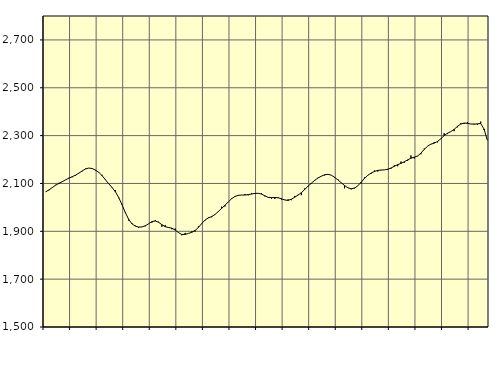
| Category | Piggar | Series 1 |
|---|---|---|
| nan | 2064.3 | 2064.78 |
| 87.0 | 2071.5 | 2073.1 |
| 87.0 | 2081.8 | 2083 |
| 87.0 | 2094.2 | 2092.59 |
| nan | 2102.5 | 2100.34 |
| 88.0 | 2106.4 | 2107.5 |
| 88.0 | 2115.4 | 2115.23 |
| 88.0 | 2123.7 | 2122.23 |
| nan | 2125.8 | 2128.19 |
| 89.0 | 2132.4 | 2134.74 |
| 89.0 | 2144.1 | 2143.06 |
| 89.0 | 2150.8 | 2152.45 |
| nan | 2162.1 | 2160.6 |
| 90.0 | 2164.4 | 2164.49 |
| 90.0 | 2161.6 | 2162.44 |
| 90.0 | 2154.4 | 2155.98 |
| nan | 2147.6 | 2146.3 |
| 91.0 | 2135.9 | 2132.57 |
| 91.0 | 2116.9 | 2115.5 |
| 91.0 | 2098.9 | 2098.54 |
| nan | 2081.7 | 2083.09 |
| 92.0 | 2072.7 | 2065.15 |
| 92.0 | 2038.4 | 2041.03 |
| 92.0 | 2012.4 | 2010.73 |
| nan | 1980.1 | 1978.08 |
| 93.0 | 1945.1 | 1949.94 |
| 93.0 | 1933.8 | 1930.96 |
| 93.0 | 1923.7 | 1921.59 |
| nan | 1915.2 | 1917.77 |
| 94.0 | 1918.5 | 1918.19 |
| 94.0 | 1920.7 | 1923.23 |
| 94.0 | 1931.4 | 1931.52 |
| nan | 1936.2 | 1940.31 |
| 95.0 | 1947.3 | 1943.38 |
| 95.0 | 1939.7 | 1937.77 |
| 95.0 | 1919.2 | 1927.63 |
| nan | 1925.8 | 1919.27 |
| 96.0 | 1914.3 | 1915.89 |
| 96.0 | 1908.7 | 1912.99 |
| 96.0 | 1911.4 | 1905.23 |
| nan | 1893.8 | 1894.56 |
| 97.0 | 1883.3 | 1886.83 |
| 97.0 | 1893.3 | 1887.03 |
| 97.0 | 1891.8 | 1891.23 |
| nan | 1899.6 | 1895.78 |
| 98.0 | 1898.9 | 1903.56 |
| 98.0 | 1920.5 | 1916.37 |
| 98.0 | 1931.3 | 1932.26 |
| nan | 1945.7 | 1947.08 |
| 99.0 | 1958 | 1955.97 |
| 99.0 | 1958.6 | 1961.88 |
| 99.0 | 1970.8 | 1970.31 |
| nan | 1981.7 | 1982.82 |
| 0.0 | 2002.9 | 1995.95 |
| 0.0 | 2003.7 | 2008.91 |
| 0.0 | 2023 | 2022.83 |
| nan | 2037.6 | 2036.16 |
| 1.0 | 2044.1 | 2045.68 |
| 1.0 | 2051.8 | 2050.3 |
| 1.0 | 2051.5 | 2051.45 |
| nan | 2055.7 | 2051.73 |
| 2.0 | 2050.5 | 2053.39 |
| 2.0 | 2059.8 | 2055.71 |
| 2.0 | 2056.1 | 2058.24 |
| nan | 2058.4 | 2058.89 |
| 3.0 | 2060.1 | 2055.67 |
| 3.0 | 2045.9 | 2048.55 |
| 3.0 | 2042.8 | 2041.95 |
| nan | 2036.5 | 2040.7 |
| 4.0 | 2035.4 | 2041.48 |
| 4.0 | 2041.7 | 2040.15 |
| 4.0 | 2033.2 | 2036.1 |
| nan | 2032.1 | 2030.87 |
| 5.0 | 2033.6 | 2029.25 |
| 5.0 | 2030.1 | 2034.21 |
| 5.0 | 2047.9 | 2042.55 |
| nan | 2052.5 | 2051.34 |
| 6.0 | 2051.1 | 2061.63 |
| 6.0 | 2079.3 | 2074.76 |
| 6.0 | 2087.5 | 2088.71 |
| nan | 2098.6 | 2100.88 |
| 7.0 | 2110.6 | 2112.73 |
| 7.0 | 2123.9 | 2122.91 |
| 7.0 | 2131 | 2130.47 |
| nan | 2133.7 | 2136.16 |
| 8.0 | 2137.2 | 2138.22 |
| 8.0 | 2134.8 | 2134.6 |
| 8.0 | 2123.2 | 2125.67 |
| nan | 2117.4 | 2115.01 |
| 9.0 | 2102.9 | 2103.18 |
| 9.0 | 2079.7 | 2091.5 |
| 9.0 | 2083.3 | 2082.04 |
| nan | 2075.6 | 2077.82 |
| 10.0 | 2081.9 | 2080.29 |
| 10.0 | 2090 | 2089.99 |
| 10.0 | 2100.2 | 2105.23 |
| nan | 2125.3 | 2121.22 |
| 11.0 | 2135 | 2134.1 |
| 11.0 | 2139.7 | 2143.43 |
| 11.0 | 2154 | 2150.25 |
| nan | 2149.7 | 2154.74 |
| 12.0 | 2155.2 | 2156.19 |
| 12.0 | 2156.6 | 2156.65 |
| 12.0 | 2156.9 | 2159.47 |
| nan | 2162 | 2164.63 |
| 13.0 | 2176 | 2171.77 |
| 13.0 | 2172 | 2178.63 |
| 13.0 | 2191.5 | 2183.96 |
| nan | 2186.9 | 2190.63 |
| 14.0 | 2195 | 2198.61 |
| 14.0 | 2217.1 | 2205.58 |
| 14.0 | 2204.5 | 2209.84 |
| nan | 2214 | 2214.97 |
| 15.0 | 2221.8 | 2226.71 |
| 15.0 | 2246.1 | 2242.4 |
| 15.0 | 2256.1 | 2255.74 |
| nan | 2263.3 | 2264.26 |
| 16.0 | 2273 | 2268.55 |
| 16.0 | 2271.8 | 2275.32 |
| 16.0 | 2285.9 | 2286.95 |
| nan | 2310 | 2299.98 |
| 17.0 | 2306.3 | 2309.92 |
| 17.0 | 2317 | 2316.76 |
| 17.0 | 2318.6 | 2326.24 |
| nan | 2334.9 | 2338.54 |
| 18.0 | 2351.9 | 2348.24 |
| 18.0 | 2348.9 | 2352.51 |
| 18.0 | 2355.6 | 2351.38 |
| nan | 2348.5 | 2348.63 |
| 19.0 | 2349.6 | 2347.8 |
| 19.0 | 2344.4 | 2349.12 |
| 19.0 | 2358.6 | 2350.7 |
| nan | 2323.6 | 2327.73 |
| 20.0 | 2280.4 | 2280.61 |